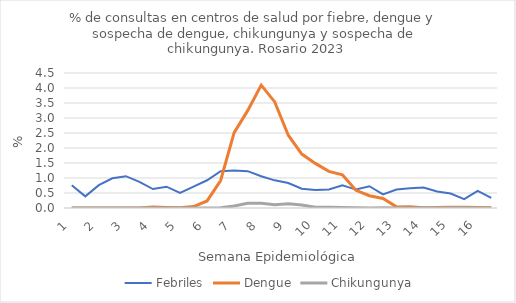
| Category | Febriles | Dengue | Chikungunya |
|---|---|---|---|
| 0 | 0.762 | 0 | 0 |
| 1 | 0.388 | 0 | 0 |
| 2 | 0.762 | 0 | 0 |
| 3 | 0.991 | 0 | 0 |
| 4 | 1.061 | 0 | 0 |
| 5 | 0.872 | 0 | 0 |
| 6 | 0.631 | 0.033 | 0 |
| 7 | 0.711 | 0.017 | 0 |
| 8 | 0.504 | 0.01 | 0 |
| 9 | 0.713 | 0.048 | 0 |
| 10 | 0.924 | 0.236 | 0 |
| 11 | 1.225 | 0.916 | 0.012 |
| 12 | 1.252 | 2.511 | 0.064 |
| 13 | 1.228 | 3.245 | 0.155 |
| 14 | 1.06 | 4.095 | 0.159 |
| 15 | 0.922 | 3.536 | 0.112 |
| 16 | 0.831 | 2.425 | 0.141 |
| 17 | 0.641 | 1.797 | 0.097 |
| 18 | 0.601 | 1.487 | 0.023 |
| 19 | 0.619 | 1.222 | 0.025 |
| 20 | 0.754 | 1.108 | 0.015 |
| 21 | 0.614 | 0.588 | 0.009 |
| 22 | 0.726 | 0.408 | 0 |
| 23 | 0.451 | 0.32 | 0.009 |
| 24 | 0.616 | 0.037 | 0 |
| 25 | 0.66 | 0.041 | 0 |
| 26 | 0.68 | 0.008 | 0.008 |
| 27 | 0.548 | 0.019 | 0 |
| 28 | 0.483 | 0.022 | 0.011 |
| 29 | 0.293 | 0.023 | 0.011 |
| 30 | 0.573 | 0.02 | 0 |
| 31 | 0.338 | 0.009 | 0 |